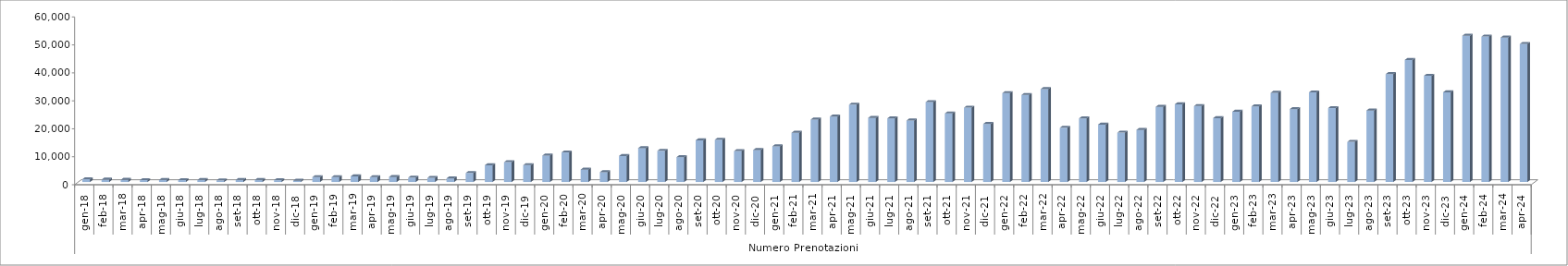
| Category | Series 0 |
|---|---|
| 0 | 996 |
| 1900-01-01 | 849 |
| 1900-01-02 | 765 |
| 1900-01-03 | 668 |
| 1900-01-04 | 737 |
| 1900-01-05 | 673 |
| 1900-01-06 | 732 |
| 1900-01-07 | 570 |
| 1900-01-08 | 752 |
| 1900-01-09 | 752 |
| 1900-01-10 | 648 |
| 1900-01-11 | 466 |
| 1900-01-12 | 1741 |
| 1900-01-13 | 1745 |
| 1900-01-14 | 2021 |
| 1900-01-15 | 1730 |
| 1900-01-16 | 1790 |
| 1900-01-17 | 1559 |
| 1900-01-18 | 1484 |
| 1900-01-19 | 1293 |
| 1900-01-20 | 3217 |
| 1900-01-21 | 5987 |
| 1900-01-22 | 7090 |
| 1900-01-23 | 6030 |
| 1900-01-24 | 9451 |
| 1900-01-25 | 10561 |
| 1900-01-26 | 4442 |
| 1900-01-27 | 3496 |
| 1900-01-28 | 9296 |
| 1900-01-29 | 12120 |
| 1900-01-30 | 11135 |
| 1900-01-31 | 8877 |
| 1900-02-01 | 14903 |
| 1900-02-02 | 15123 |
| 1900-02-03 | 11075 |
| 1900-02-04 | 11456 |
| 1900-02-05 | 12756 |
| 1900-02-06 | 17612 |
| 1900-02-07 | 22323 |
| 1900-02-08 | 23401 |
| 1900-02-09 | 27652 |
| 1900-02-10 | 22918 |
| 1900-02-11 | 22750 |
| 1900-02-12 | 21988 |
| 1900-02-13 | 28587 |
| 1900-02-14 | 24526 |
| 1900-02-15 | 26608 |
| 1900-02-16 | 20755 |
| 1900-02-17 | 31777 |
| 1900-02-18 | 31128 |
| 1900-02-19 | 33234 |
| 1900-02-20 | 19395 |
| 1900-02-21 | 22731 |
| 1900-02-22 | 20543 |
| 1900-02-23 | 17657 |
| 1900-02-24 | 18639 |
| 1900-02-25 | 26870 |
| 1900-02-26 | 27796 |
| 1900-02-27 | 27163 |
| 1900-02-28 | 22847 |
| 1900-02-28 | 25133 |
| 1900-03-01 | 27034 |
| 1900-03-02 | 31908 |
| 1900-03-03 | 26073 |
| 1900-03-04 | 32052 |
| 1900-03-05 | 26434 |
| 1900-03-06 | 14356 |
| 1900-03-07 | 25574 |
| 1900-03-08 | 38589 |
| 1900-03-09 | 43658 |
| 1900-03-10 | 37985 |
| 1900-03-11 | 32076 |
| 1900-03-12 | 52292 |
| 1900-03-13 | 52030 |
| 1900-03-14 | 51663 |
| 1900-03-15 | 49368 |